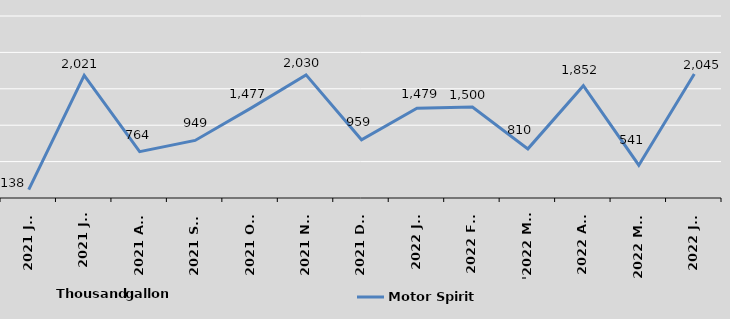
| Category | Motor Spirit  |
|---|---|
| 2021 Jun | 138 |
| 2021 Jul | 2021 |
| 2021 Aug | 764 |
| 2021 Sep | 949 |
| 2021 Oct | 1477 |
| 2021 Nov | 2030 |
| 2021 Dec | 959 |
| 2022 Jan | 1479 |
| 2022 Feb | 1500 |
| '2022 Mar | 810 |
| 2022 Apr | 1852 |
| 2022 May | 541 |
| 2022 Jun | 2045 |